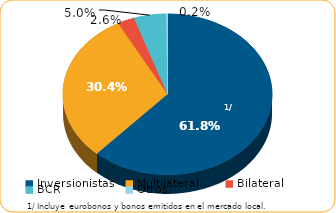
| Category | Series 0 |
|---|---|
| Inversionistas | 8730.1 |
| Multilateral | 4299 |
| Bilateral | 369.2 |
| BCR | 704.3 |
| Otros | 32.5 |